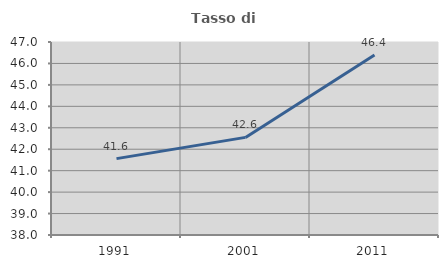
| Category | Tasso di occupazione   |
|---|---|
| 1991.0 | 41.562 |
| 2001.0 | 42.552 |
| 2011.0 | 46.392 |